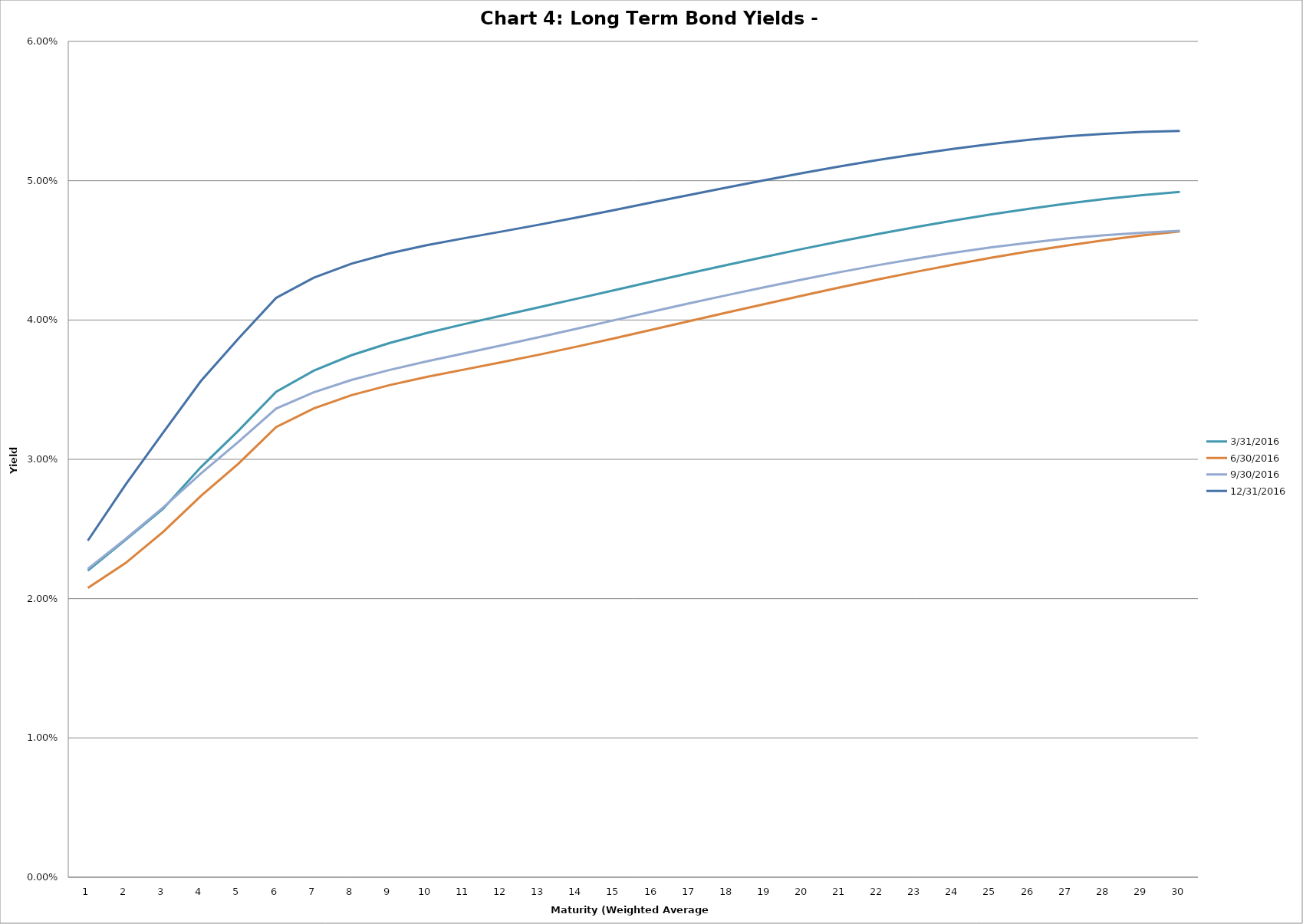
| Category | 3/31/2016 | 6/30/2016 | 9/30/2016 | 12/31/2016 |
|---|---|---|---|---|
| 0 | 0.022 | 0.021 | 0.022 | 0.024 |
| 1 | 0.024 | 0.023 | 0.024 | 0.028 |
| 2 | 0.026 | 0.025 | 0.027 | 0.032 |
| 3 | 0.029 | 0.027 | 0.029 | 0.036 |
| 4 | 0.032 | 0.03 | 0.031 | 0.039 |
| 5 | 0.035 | 0.032 | 0.034 | 0.042 |
| 6 | 0.036 | 0.034 | 0.035 | 0.043 |
| 7 | 0.037 | 0.035 | 0.036 | 0.044 |
| 8 | 0.038 | 0.035 | 0.036 | 0.045 |
| 9 | 0.039 | 0.036 | 0.037 | 0.045 |
| 10 | 0.04 | 0.036 | 0.038 | 0.046 |
| 11 | 0.04 | 0.037 | 0.038 | 0.046 |
| 12 | 0.041 | 0.038 | 0.039 | 0.047 |
| 13 | 0.042 | 0.038 | 0.039 | 0.047 |
| 14 | 0.042 | 0.039 | 0.04 | 0.048 |
| 15 | 0.043 | 0.039 | 0.041 | 0.048 |
| 16 | 0.043 | 0.04 | 0.041 | 0.049 |
| 17 | 0.044 | 0.041 | 0.042 | 0.05 |
| 18 | 0.045 | 0.041 | 0.042 | 0.05 |
| 19 | 0.045 | 0.042 | 0.043 | 0.051 |
| 20 | 0.046 | 0.042 | 0.043 | 0.051 |
| 21 | 0.046 | 0.043 | 0.044 | 0.051 |
| 22 | 0.047 | 0.043 | 0.044 | 0.052 |
| 23 | 0.047 | 0.044 | 0.045 | 0.052 |
| 24 | 0.048 | 0.044 | 0.045 | 0.053 |
| 25 | 0.048 | 0.045 | 0.046 | 0.053 |
| 26 | 0.048 | 0.045 | 0.046 | 0.053 |
| 27 | 0.049 | 0.046 | 0.046 | 0.053 |
| 28 | 0.049 | 0.046 | 0.046 | 0.054 |
| 29 | 0.049 | 0.046 | 0.046 | 0.054 |